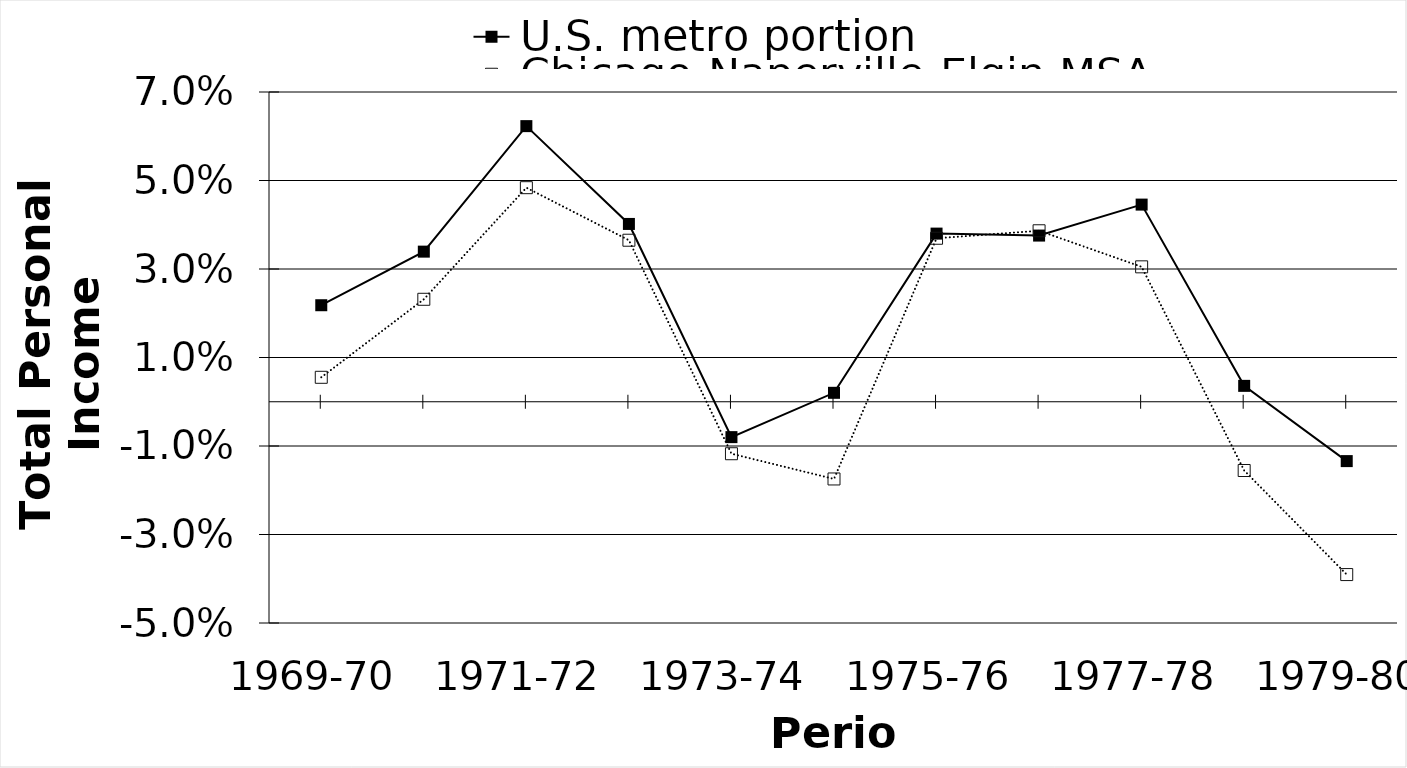
| Category | U.S. metro portion | Chicago-Naperville-Elgin MSA |
|---|---|---|
| 1969-70 | 0.022 | 0.006 |
| 1970-71 | 0.034 | 0.023 |
| 1971-72 | 0.062 | 0.048 |
| 1972-73 | 0.04 | 0.037 |
| 1973-74 | -0.008 | -0.012 |
| 1974-75 | 0.002 | -0.017 |
| 1975-76 | 0.038 | 0.037 |
| 1976-77 | 0.038 | 0.039 |
| 1977-78 | 0.045 | 0.03 |
| 1978-79 | 0.004 | -0.016 |
| 1979-80 | -0.013 | -0.039 |